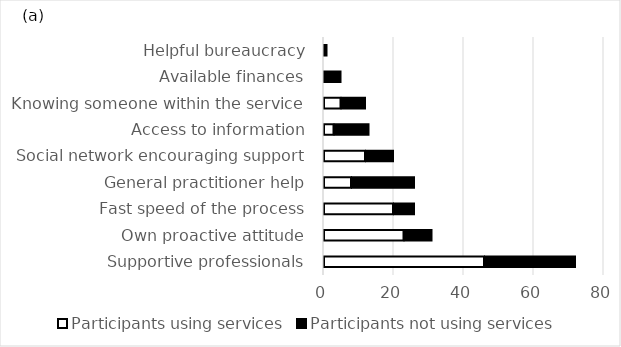
| Category | Participants using services | Participants not using services |
|---|---|---|
| Supportive professionals | 46 | 26 |
| Own proactive attitude | 23 | 8 |
| Fast speed of the process | 20 | 6 |
| General practitioner help | 8 | 18 |
| Social network encouraging support | 12 | 8 |
| Access to information | 3 | 10 |
| Knowing someone within the service | 5 | 7 |
| Available finances | 0 | 5 |
| Helpful bureaucracy | 0 | 1 |